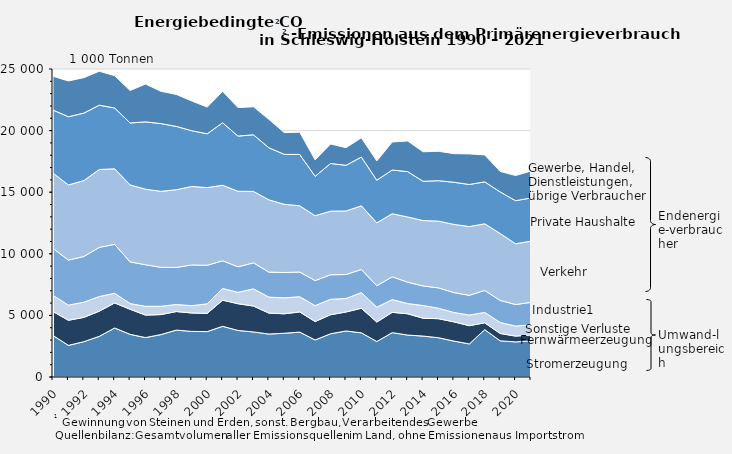
| Category | Stromerzeugung | Fernwärmeerzeugung | Sonstige Verluste | Industrie1 | Verkehr | Private Haushalte | Gewerbe, Handel, Dienstleistungen, übrige Verbraucher |
|---|---|---|---|---|---|---|---|
| 1990.0 | 3371.486 | 1943.547 | 1320.394 | 3804.727 | 6112.816 | 5116.565 | 2742.045 |
| 1991.0 | 2567.638 | 2036.341 | 1227.548 | 3657.508 | 6098.15 | 5539.379 | 2901.175 |
| 1992.0 | 2865.272 | 1974.446 | 1236.431 | 3705.024 | 6162.39 | 5476.347 | 2877.899 |
| 1993.0 | 3299.486 | 2038.85 | 1193.324 | 3989.26 | 6324.022 | 5217.371 | 2755.161 |
| 1994.0 | 3978.563 | 2034.488 | 780.207 | 3971.838 | 6134.103 | 4934.446 | 2627.258 |
| 1995.0 | 3461.174 | 2037.907 | 461.206 | 3383.339 | 6249.129 | 5026.487 | 2634.874 |
| 1996.0 | 3200.925 | 1824.56 | 714.035 | 3374.85 | 6128.805 | 5465.821 | 3070.011 |
| 1997.0 | 3444.901 | 1621.57 | 676.661 | 3159.924 | 6166.729 | 5497.646 | 2622.821 |
| 1998.0 | 3806.562 | 1507.285 | 570.944 | 3008.594 | 6306.922 | 5139.531 | 2595.114 |
| 1999.0 | 3701.846 | 1494.129 | 593.502 | 3308.974 | 6370.874 | 4520.523 | 2415.679 |
| 2000.0 | 3684.83 | 1480.565 | 774.837 | 3128.248 | 6304.226 | 4368.588 | 2165.202 |
| 2001.0 | 4114.152 | 2123.547 | 949.324 | 2245.338 | 6132.787 | 5069.669 | 2550.382 |
| 2002.0 | 3778.969 | 2167.503 | 924.024 | 2075.858 | 6126.35 | 4482.009 | 2311.335 |
| 2003.0 | 3657.903 | 2103.241 | 1397.822 | 2106.054 | 5801.612 | 4594.38 | 2274.209 |
| 2004.0 | 3486.007 | 1703.968 | 1293.687 | 2030.891 | 5867.799 | 4227.637 | 2303.604 |
| 2005.0 | 3552.044 | 1578.614 | 1294.132 | 2054.86 | 5540.796 | 4050.809 | 1764.411 |
| 2006.0 | 3643.907 | 1638.247 | 1238.972 | 1997.205 | 5378.38 | 4170.409 | 1805.938 |
| 2007.0 | 3004.687 | 1496.461 | 1292.318 | 2035.318 | 5262.188 | 3199.223 | 1336.259 |
| 2008.0 | 3509.988 | 1542.883 | 1256.852 | 1988.054 | 5164.237 | 3870.983 | 1578.564 |
| 2009.0 | 3734.75 | 1542.786 | 1095.011 | 1945.8 | 5155.296 | 3709.951 | 1429.667 |
| 2010.0 | 3585.919 | 1996.268 | 1267.868 | 1881.478 | 5162.522 | 3959.148 | 1558.676 |
| 2011.0 | 2879.738 | 1581.922 | 1206.749 | 1739.39 | 5109.738 | 3457.373 | 1565.613 |
| 2012.0 | 3601.462 | 1648.576 | 1033.744 | 1851.217 | 5118.803 | 3548.876 | 2268.908 |
| 2013.0 | 3403.962 | 1727.789 | 827.25 | 1739.787 | 5290.308 | 3681.455 | 2489.114 |
| 2014.0 | 3322.901 | 1448.232 | 1033.243 | 1584.828 | 5308.429 | 3189.364 | 2395.579 |
| 2015.0 | 3187.226 | 1545.845 | 850.917 | 1651.277 | 5418.067 | 3281.801 | 2387.125 |
| 2016.0 | 2916.005 | 1558.909 | 764.577 | 1612.66 | 5535.012 | 3420.135 | 2323.633 |
| 2017.0 | 2683.979 | 1481.155 | 862.72 | 1603.128 | 5582.449 | 3413.039 | 2482.317 |
| 2018.0 | 3845.35 | 554.918 | 841.573 | 1787.701 | 5405.609 | 3403.149 | 2189.77 |
| 2019.0 | 2937.55 | 596.431 | 892.613 | 1789.282 | 5433.428 | 3373.575 | 1665.523 |
| 2020.0 | 2850.117 | 469.279 | 816.039 | 1747.903 | 4931.494 | 3494.983 | 2042.085 |
| 2021.0 | 2928.601 | 484.721 | 824.674 | 1819.481 | 4969.232 | 3506.757 | 2180.923 |